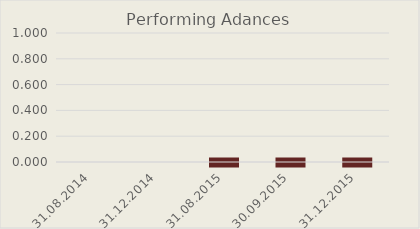
| Category | Performing Adances |
|---|---|
| 31.08.2014 | 0 |
| 31.12.2014 | 0 |
| 31.08.2015 | 0 |
| 30.09.2015 | 0 |
| 31.12.2015 | 0 |